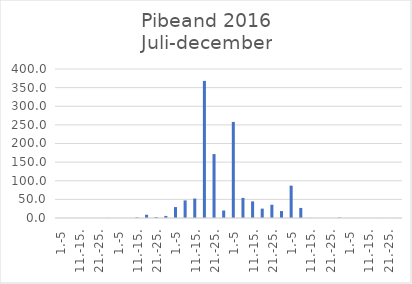
| Category | Series 0 |
|---|---|
| 1.-5 | 0 |
| 6.-10. | 0 |
| 11.-15. | 0 |
| 16.-20. | 0 |
| 21.-25. | 0 |
| 26.-31. | 0.251 |
| 1.-5 | 0 |
| 6.-10. | 0 |
| 11.-15. | 1.519 |
| 16.-20. | 8.774 |
| 21.-25. | 2.359 |
| 26.-31. | 5.595 |
| 1.-5 | 29.331 |
| 6.-10. | 47.214 |
| 11.-15. | 52.17 |
| 16.-20. | 368.039 |
| 21.-25. | 171.567 |
| 26.-30. | 20.128 |
| 1.-5 | 257.95 |
| 6.-10. | 53.996 |
| 11.-15. | 44.563 |
| 16.-20. | 25.175 |
| 21.-25. | 35.563 |
| 26.-31. | 18.668 |
| 1.-5 | 86.858 |
| 6.-10. | 27.053 |
| 11.-15. | 0.353 |
| 16.-20. | 0 |
| 21.-25. | 0.037 |
| 26.-30. | 1.235 |
| 1.-5 | 0.119 |
| 6.-10. | 0.167 |
| 11.-15. | 0 |
| 16.-20. | 0.128 |
| 21.-25. | 0 |
| 26.-31. | 0.118 |